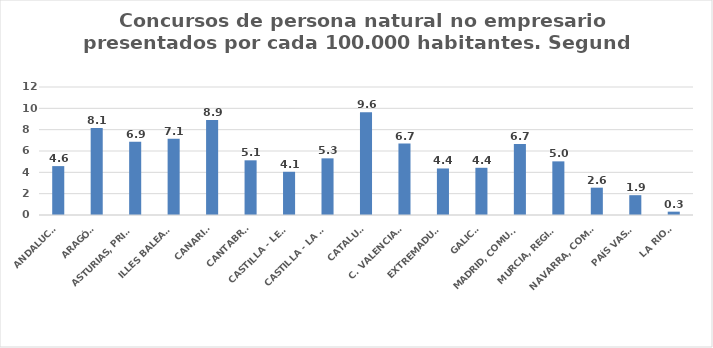
| Category | Series 0 |
|---|---|
| ANDALUCÍA | 4.583 |
| ARAGÓN | 8.149 |
| ASTURIAS, PRINCIPADO | 6.869 |
| ILLES BALEARS | 7.141 |
| CANARIAS | 8.914 |
| CANTABRIA | 5.126 |
| CASTILLA - LEÓN | 4.051 |
| CASTILLA - LA MANCHA | 5.311 |
| CATALUÑA | 9.623 |
| C. VALENCIANA | 6.698 |
| EXTREMADURA | 4.363 |
| GALICIA | 4.425 |
| MADRID, COMUNIDAD | 6.657 |
| MURCIA, REGIÓN | 5.028 |
| NAVARRA, COM. FORAL | 2.562 |
| PAÍS VASCO | 1.858 |
| LA RIOJA | 0.313 |